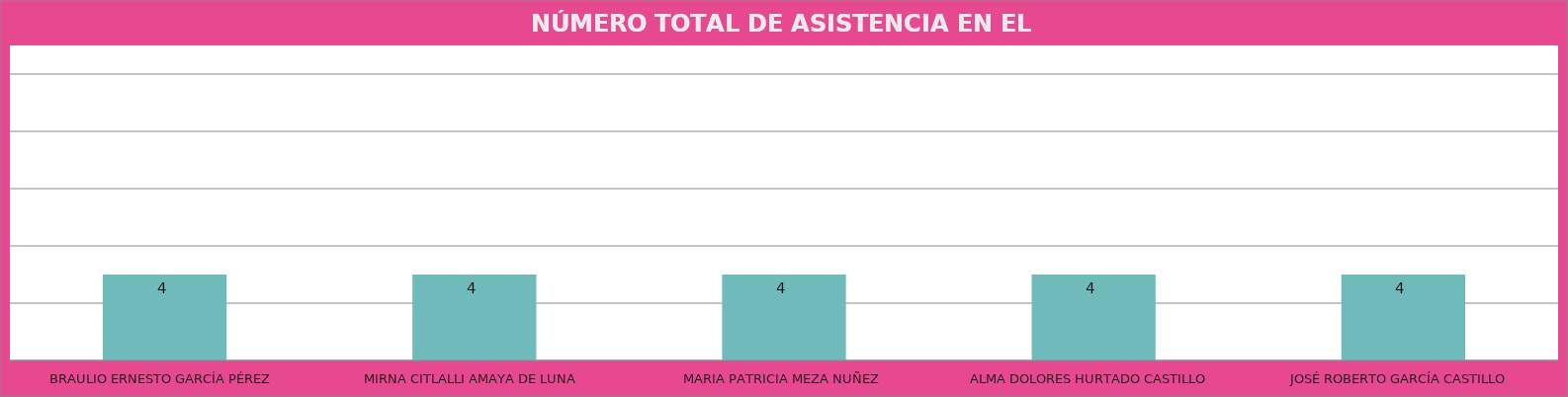
| Category | BRAULIO ERNESTO GARCÍA PÉREZ MIRNA CITLALLI AMAYA DE LUNA MARIA PATRICIA MEZA NUÑEZ ALMA DOLORES HURTADO CASTILLO JOSÉ ROBERTO GARCÍA CASTILLO |
|---|---|
| BRAULIO ERNESTO GARCÍA PÉREZ | 4 |
| MIRNA CITLALLI AMAYA DE LUNA | 4 |
| MARIA PATRICIA MEZA NUÑEZ | 4 |
| ALMA DOLORES HURTADO CASTILLO | 4 |
| JOSÉ ROBERTO GARCÍA CASTILLO | 4 |